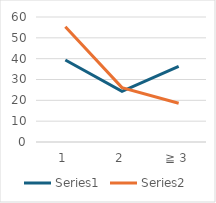
| Category | Series 0 | Series 1 |
|---|---|---|
| 1 | 39.366 | 55.273 |
| 2 | 24.285 | 26.116 |
| ≧ 3 | 36.349 | 18.611 |